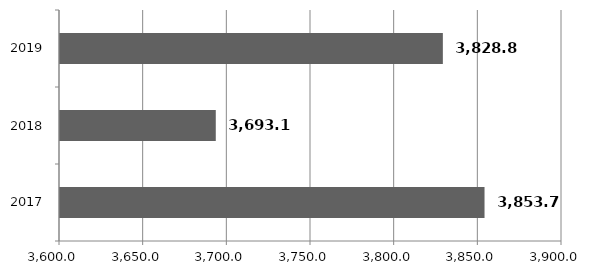
| Category | Series 0 |
|---|---|
| 2017.0 | 3853.7 |
| 2018.0 | 3693.097 |
| 2019.0 | 3828.8 |